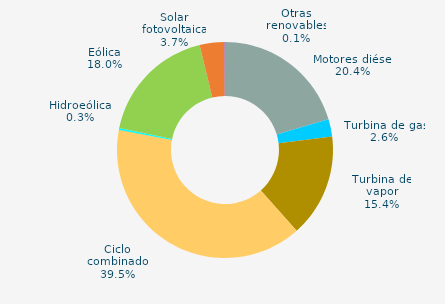
| Category | Series 0 |
|---|---|
| Motores diésel | 20.401 |
| Turbina de gas | 2.619 |
| Turbina de vapor | 15.426 |
| Ciclo combinado | 39.5 |
| Cogeneración | 0 |
| Hidráulica | 0.041 |
| Hidroeólica | 0.261 |
| Eólica | 17.975 |
| Solar fotovoltaica | 3.685 |
| Otras renovables | 0.091 |